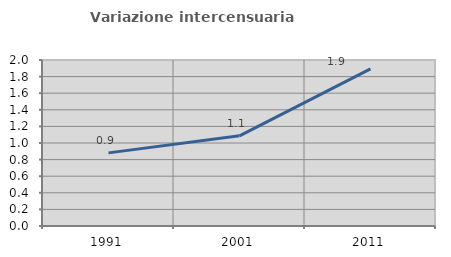
| Category | Variazione intercensuaria annua |
|---|---|
| 1991.0 | 0.881 |
| 2001.0 | 1.086 |
| 2011.0 | 1.894 |